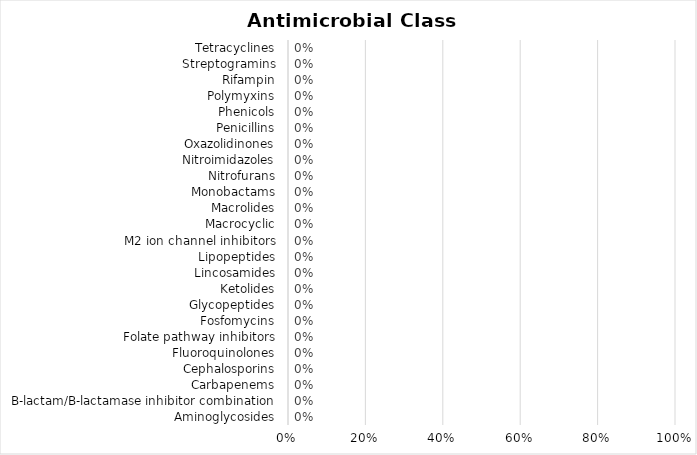
| Category | Series 0 |
|---|---|
| Aminoglycosides | 0 |
| B-lactam/B-lactamase inhibitor combination | 0 |
| Carbapenems | 0 |
| Cephalosporins | 0 |
| Fluoroquinolones | 0 |
| Folate pathway inhibitors | 0 |
| Fosfomycins | 0 |
| Glycopeptides | 0 |
| Ketolides | 0 |
| Lincosamides | 0 |
| Lipopeptides | 0 |
| M2 ion channel inhibitors | 0 |
| Macrocyclic | 0 |
| Macrolides | 0 |
| Monobactams | 0 |
| Nitrofurans | 0 |
| Nitroimidazoles | 0 |
| Oxazolidinones | 0 |
| Penicillins | 0 |
| Phenicols | 0 |
| Polymyxins | 0 |
| Rifampin | 0 |
| Streptogramins | 0 |
| Tetracyclines | 0 |